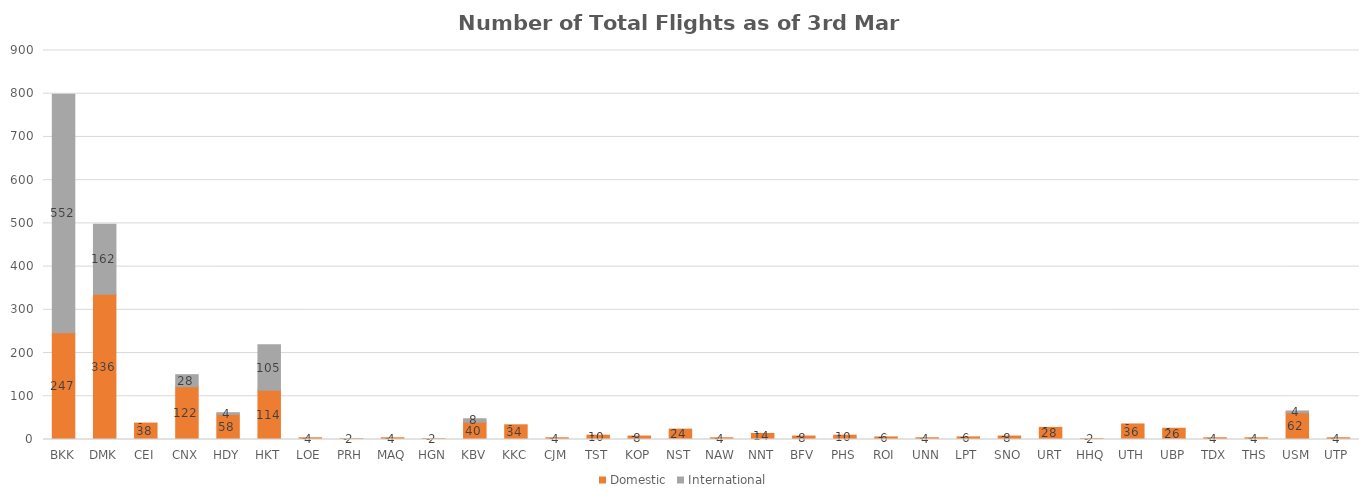
| Category | Domestic | International |
|---|---|---|
| BKK | 247 | 552 |
| DMK | 336 | 162 |
| CEI | 38 | 0 |
| CNX | 122 | 28 |
| HDY | 58 | 4 |
| HKT | 114 | 105 |
| LOE | 4 | 0 |
| PRH | 2 | 0 |
| MAQ | 4 | 0 |
| HGN | 2 | 0 |
| KBV | 40 | 8 |
| KKC | 34 | 0 |
| CJM | 4 | 0 |
| TST | 10 | 0 |
| KOP | 8 | 0 |
| NST | 24 | 0 |
| NAW | 4 | 0 |
| NNT | 14 | 0 |
| BFV | 8 | 0 |
| PHS | 10 | 0 |
| ROI | 6 | 0 |
| UNN | 4 | 0 |
| LPT | 6 | 0 |
| SNO | 8 | 0 |
| URT | 28 | 0 |
| HHQ | 2 | 0 |
| UTH | 36 | 0 |
| UBP | 26 | 0 |
| TDX | 4 | 0 |
| THS | 4 | 0 |
| USM | 62 | 4 |
| UTP | 4 | 0 |